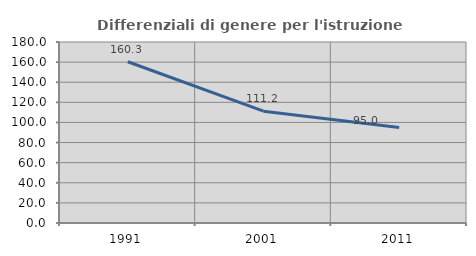
| Category | Differenziali di genere per l'istruzione superiore |
|---|---|
| 1991.0 | 160.338 |
| 2001.0 | 111.176 |
| 2011.0 | 94.996 |